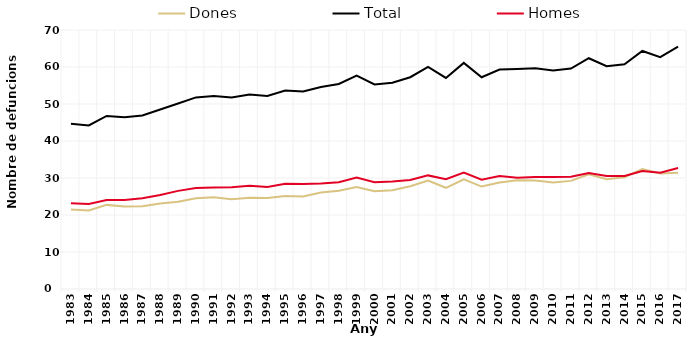
| Category | Dones | Total | Homes |
|---|---|---|---|
| 1983.0 | 21491 | 44691 | 23200 |
| 1984.0 | 21241 | 44206 | 22965 |
| 1985.0 | 22734 | 46773 | 24039 |
| 1986.0 | 22323 | 46406 | 24083 |
| 1987.0 | 22387 | 46901 | 24514 |
| 1988.0 | 23100 | 48527 | 25427 |
| 1989.0 | 23610 | 50129 | 26519 |
| 1990.0 | 24509 | 51777 | 27268 |
| 1991.0 | 24789 | 52190 | 27401 |
| 1992.0 | 24288 | 51771 | 27483 |
| 1993.0 | 24637 | 52570 | 27931 |
| 1994.0 | 24598 | 52191 | 27593 |
| 1995.0 | 25155 | 53628 | 28473 |
| 1996.0 | 25016 | 53362 | 28346 |
| 1997.0 | 26069 | 54592 | 28523 |
| 1998.0 | 26545 | 55414 | 28869 |
| 1999.0 | 27562 | 57676 | 30114 |
| 2000.0 | 26447 | 55279 | 28832 |
| 2001.0 | 26682 | 55741 | 29059 |
| 2002.0 | 27772 | 57234 | 29462 |
| 2003.0 | 29334 | 60037 | 30703 |
| 2004.0 | 27354 | 57051 | 29697 |
| 2005.0 | 29651 | 61106 | 31455 |
| 2006.0 | 27683 | 57227 | 29544 |
| 2007.0 | 28780 | 59312 | 30532 |
| 2008.0 | 29375 | 59474 | 30099 |
| 2009.0 | 29340 | 59631 | 30291 |
| 2010.0 | 28797 | 59057 | 30260 |
| 2011.0 | 29223 | 59576 | 30353 |
| 2012.0 | 31022 | 62373 | 31351 |
| 2013.0 | 29679 | 60210 | 30531 |
| 2014.0 | 30196 | 60730 | 30534 |
| 2015.0 | 32443 | 64336 | 31893 |
| 2016.0 | 31236 | 62649 | 31413 |
| 2017.0 | 31413 | 65509 | 32684 |